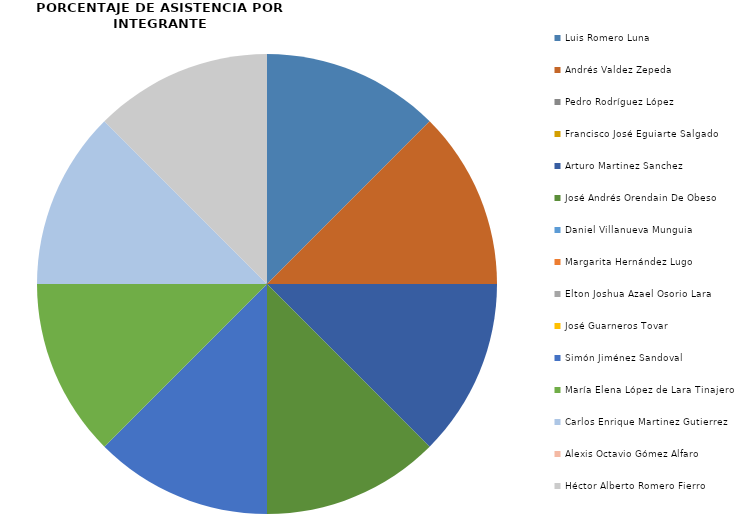
| Category | Series 0 |
|---|---|
| Luis Romero Luna | 1 |
| Andrés Valdez Zepeda | 1 |
| Pedro Rodríguez López | 0 |
| Francisco José Eguiarte Salgado | 0 |
| Arturo Martinez Sanchez  | 1 |
| José Andrés Orendain De Obeso | 1 |
| Daniel Villanueva Munguia | 0 |
| Margarita Hernández Lugo | 0 |
| Elton Joshua Azael Osorio Lara | 0 |
| José Guarneros Tovar | 0 |
| Simón Jiménez Sandoval | 1 |
| María Elena López de Lara Tinajero | 1 |
| Carlos Enrique Martinez Gutierrez | 1 |
| Alexis Octavio Gómez Alfaro | 0 |
| Héctor Alberto Romero Fierro | 1 |